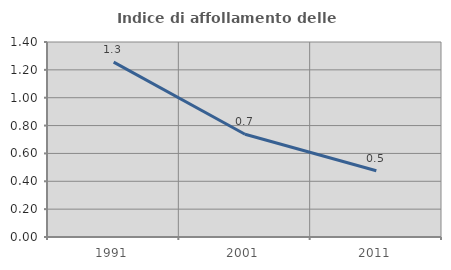
| Category | Indice di affollamento delle abitazioni  |
|---|---|
| 1991.0 | 1.256 |
| 2001.0 | 0.738 |
| 2011.0 | 0.476 |